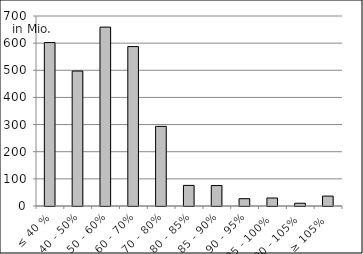
| Category | Volumen |
|---|---|
| ≤ 40 % | 602023698.887 |
| 40 - 50% | 497237136.589 |
| 50 - 60% | 659046806.409 |
| 60 - 70% | 587327292.154 |
| 70 - 80% | 293411879.54 |
| 80 - 85% | 75894636.404 |
| 85 - 90% | 75303924.121 |
| 90 - 95% | 26905279.005 |
| 95 - 100% | 29429737.702 |
| 100 - 105% | 10135253.764 |
| ≥ 105% | 36443023.666 |